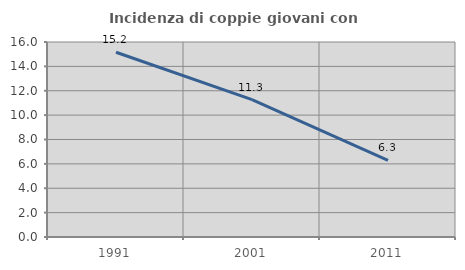
| Category | Incidenza di coppie giovani con figli |
|---|---|
| 1991.0 | 15.161 |
| 2001.0 | 11.275 |
| 2011.0 | 6.294 |